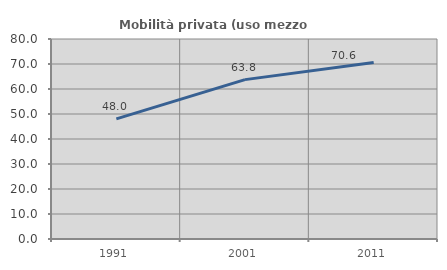
| Category | Mobilità privata (uso mezzo privato) |
|---|---|
| 1991.0 | 48.029 |
| 2001.0 | 63.75 |
| 2011.0 | 70.615 |